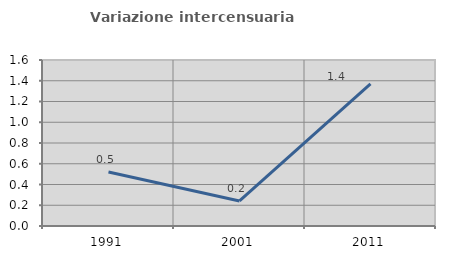
| Category | Variazione intercensuaria annua |
|---|---|
| 1991.0 | 0.521 |
| 2001.0 | 0.242 |
| 2011.0 | 1.369 |